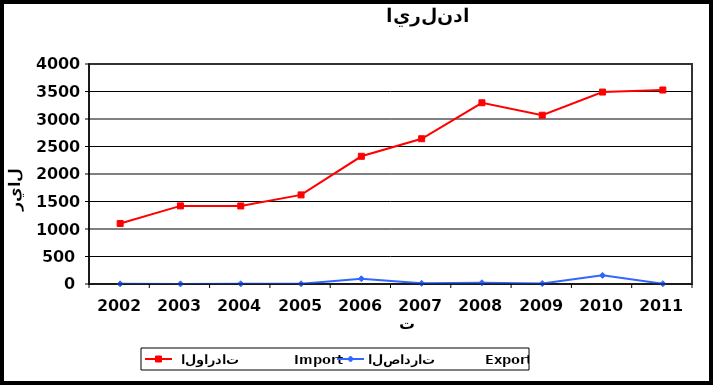
| Category |  الواردات           Import | الصادرات          Export |
|---|---|---|
| 2002.0 | 1100 | 3 |
| 2003.0 | 1420 | 2 |
| 2004.0 | 1419 | 4 |
| 2005.0 | 1620 | 4 |
| 2006.0 | 2322 | 95 |
| 2007.0 | 2641 | 13 |
| 2008.0 | 3295 | 22 |
| 2009.0 | 3069 | 9 |
| 2010.0 | 3490 | 157 |
| 2011.0 | 3527 | 5 |